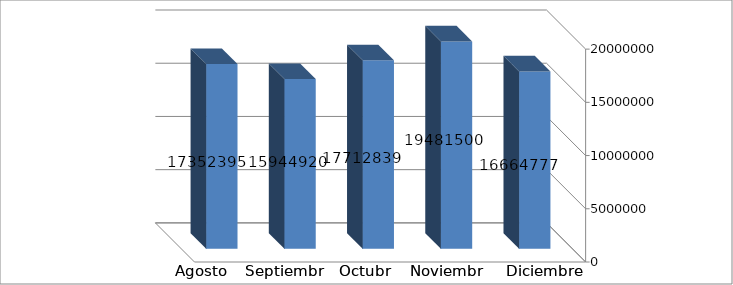
| Category | Series 0 |
|---|---|
| 0 | 16664777 |
| 1 | 19481500 |
| 2 | 17712839 |
| 3 | 15944920 |
| 4 | 17352395 |